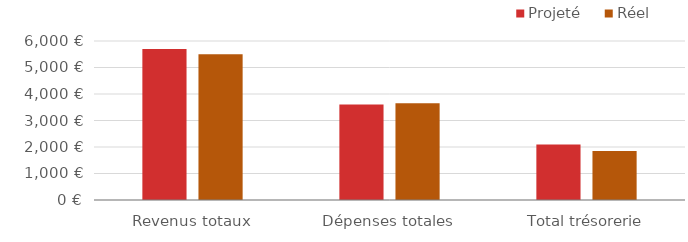
| Category | Projeté | Réel |
|---|---|---|
| Revenus totaux | 5700 | 5500 |
| Dépenses totales | 3603 | 3655 |
| Total trésorerie | 2097 | 1845 |